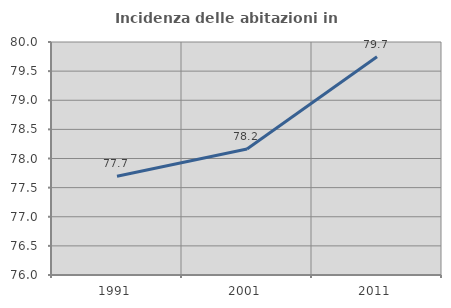
| Category | Incidenza delle abitazioni in proprietà  |
|---|---|
| 1991.0 | 77.696 |
| 2001.0 | 78.163 |
| 2011.0 | 79.746 |